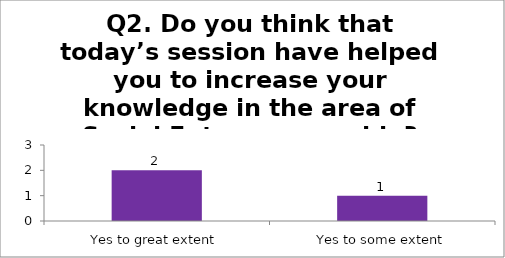
| Category | Q2. Do you think that today’s session have helped you to increase your knowledge in the area of Social Entrepreneurship? |
|---|---|
| Yes to great extent | 2 |
| Yes to some extent | 1 |